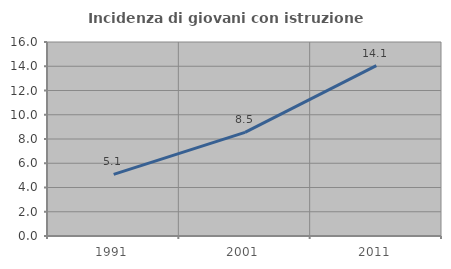
| Category | Incidenza di giovani con istruzione universitaria |
|---|---|
| 1991.0 | 5.085 |
| 2001.0 | 8.543 |
| 2011.0 | 14.054 |